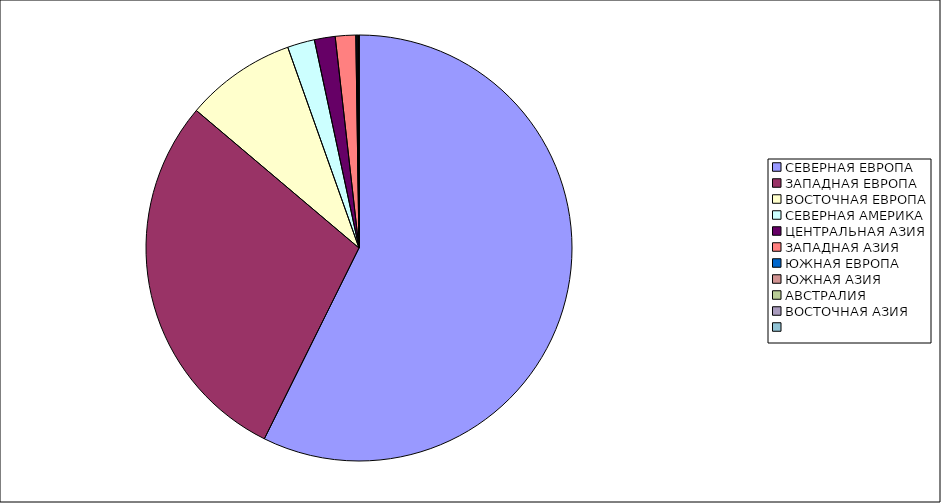
| Category | Оборот |
|---|---|
| СЕВЕРНАЯ ЕВРОПА | 57.329 |
| ЗАПАДНАЯ ЕВРОПА | 28.84 |
| ВОСТОЧНАЯ ЕВРОПА | 8.404 |
| СЕВЕРНАЯ АМЕРИКА | 2.062 |
| ЦЕНТРАЛЬНАЯ АЗИЯ | 1.579 |
| ЗАПАДНАЯ АЗИЯ | 1.548 |
| ЮЖНАЯ ЕВРОПА | 0.085 |
| ЮЖНАЯ АЗИЯ | 0.073 |
| АВСТРАЛИЯ | 0.06 |
| ВОСТОЧНАЯ АЗИЯ | 0.02 |